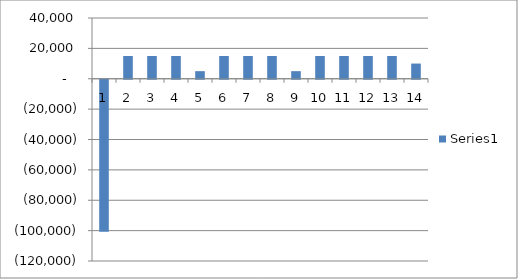
| Category | Series 0 |
|---|---|
| 0 | -100000 |
| 1 | 15000 |
| 2 | 15000 |
| 3 | 15000 |
| 4 | 5000 |
| 5 | 15000 |
| 6 | 15000 |
| 7 | 15000 |
| 8 | 5000 |
| 9 | 15000 |
| 10 | 15000 |
| 11 | 15000 |
| 12 | 15000 |
| 13 | 10000 |